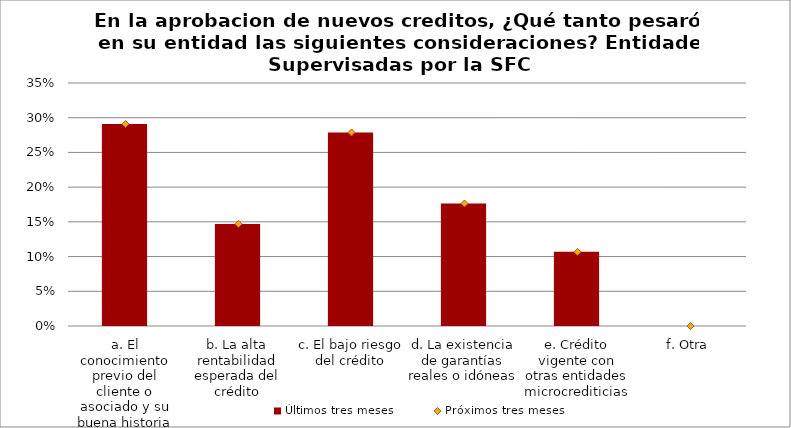
| Category | Últimos tres meses |
|---|---|
| a. El conocimiento previo del cliente o asociado y su buena historia de crédito | 0.291 |
| b. La alta rentabilidad esperada del crédito | 0.147 |
| c. El bajo riesgo del crédito | 0.279 |
| d. La existencia de garantías reales o idóneas | 0.176 |
| e. Crédito vigente con otras entidades microcrediticias | 0.107 |
| f. Otra | 0 |